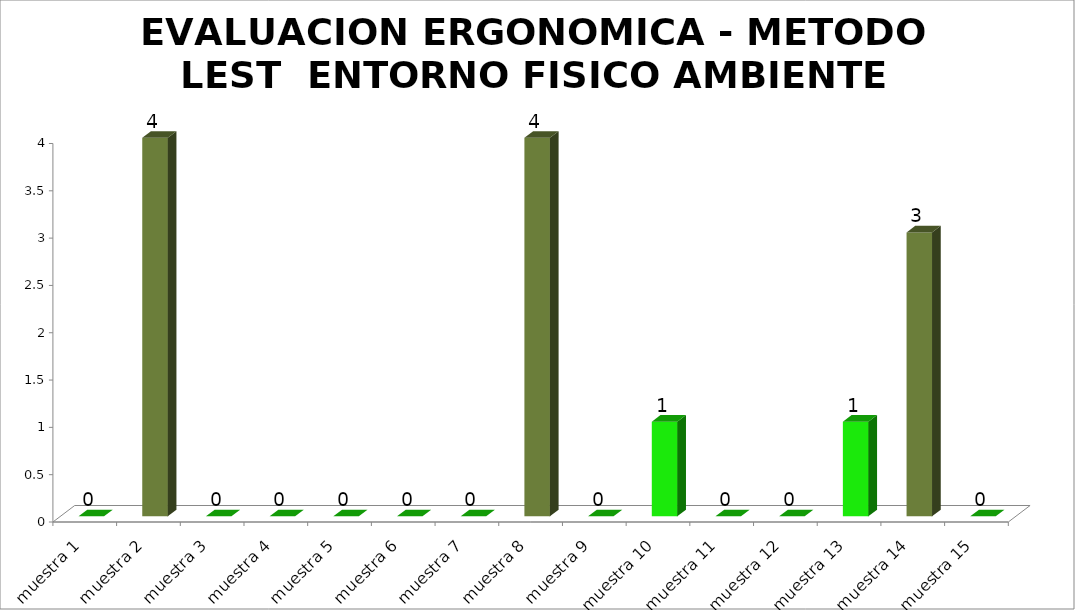
| Category | EVALUACION ERGONOMICA - METODO LEST  |
|---|---|
| muestra 1 | 0 |
| muestra 2 | 4 |
| muestra 3 | 0 |
| muestra 4 | 0 |
| muestra 5 | 0 |
| muestra 6 | 0 |
| muestra 7 | 0 |
| muestra 8 | 4 |
| muestra 9 | 0 |
| muestra 10 | 1 |
| muestra 11 | 0 |
| muestra 12 | 0 |
| muestra 13 | 1 |
| muestra 14 | 3 |
| muestra 15 | 0 |